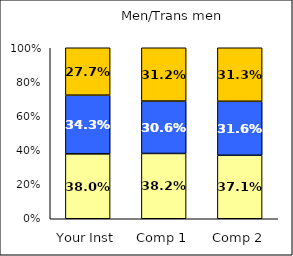
| Category | Low Respect | Average Respect | High Respect |
|---|---|---|---|
| Your Inst | 0.38 | 0.343 | 0.277 |
| Comp 1 | 0.382 | 0.306 | 0.312 |
| Comp 2 | 0.371 | 0.316 | 0.313 |